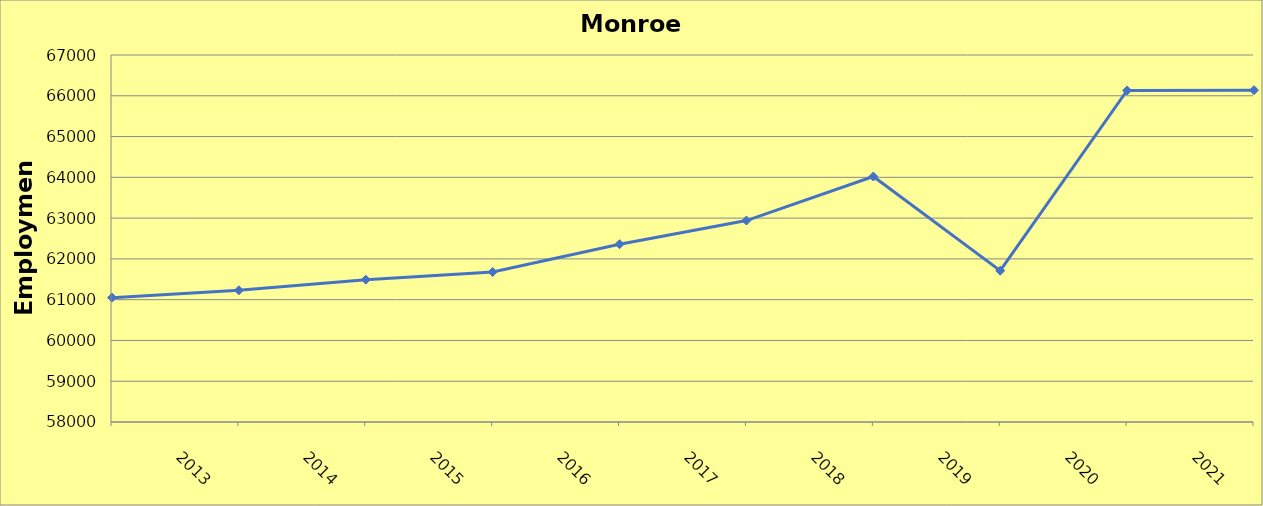
| Category | Monroe County |
|---|---|
| 2013.0 | 61050 |
| 2014.0 | 61230 |
| 2015.0 | 61490 |
| 2016.0 | 61680 |
| 2017.0 | 62360 |
| 2018.0 | 62940 |
| 2019.0 | 64020 |
| 2020.0 | 61710 |
| 2021.0 | 66130 |
| 2022.0 | 66137 |